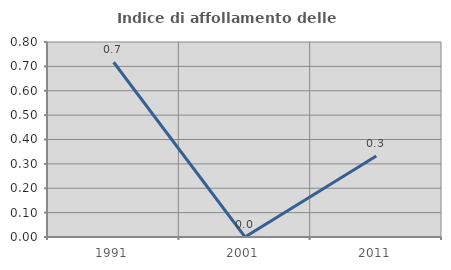
| Category | Indice di affollamento delle abitazioni  |
|---|---|
| 1991.0 | 0.717 |
| 2001.0 | 0 |
| 2011.0 | 0.332 |